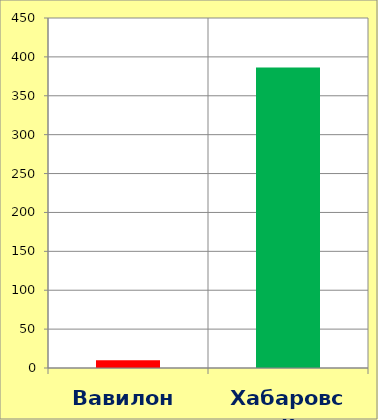
| Category | Series 0 |
|---|---|
| Вавилон | 10 |
| Хабаровск | 386.4 |